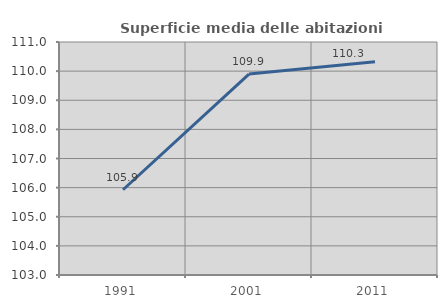
| Category | Superficie media delle abitazioni occupate |
|---|---|
| 1991.0 | 105.927 |
| 2001.0 | 109.898 |
| 2011.0 | 110.318 |